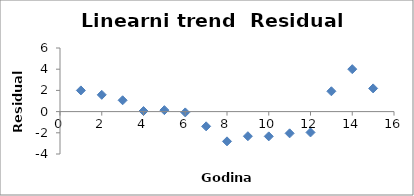
| Category | Series 0 |
|---|---|
| 1.0 | 1.998 |
| 2.0 | 1.583 |
| 3.0 | 1.068 |
| 4.0 | 0.053 |
| 5.0 | 0.138 |
| 6.0 | -0.077 |
| 7.0 | -1.392 |
| 8.0 | -2.807 |
| 9.0 | -2.322 |
| 10.0 | -2.337 |
| 11.0 | -2.052 |
| 12.0 | -1.967 |
| 13.0 | 1.918 |
| 14.0 | 4.003 |
| 15.0 | 2.188 |